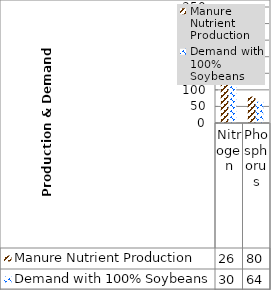
| Category | Manure Nutrient Production | Demand with 100% Soybeans |
|---|---|---|
| Nitrogen | 262.418 | 304 |
| Phosphorus | 79.761 | 64 |